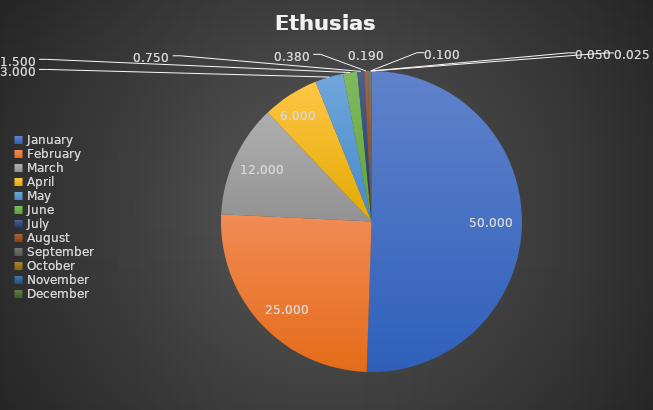
| Category | Ethusiasm |
|---|---|
| January | 50 |
| February | 25 |
| March | 12 |
| April | 6 |
| May | 3 |
| June | 1.5 |
| July | 0.75 |
| August | 0.38 |
| September | 0.19 |
| October | 0.1 |
| November | 0.05 |
| December | 0.025 |